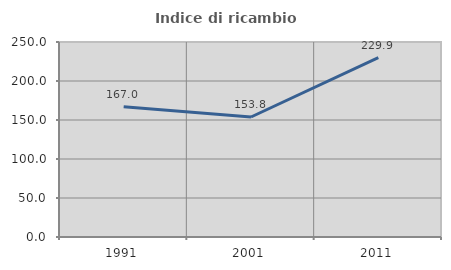
| Category | Indice di ricambio occupazionale  |
|---|---|
| 1991.0 | 167.041 |
| 2001.0 | 153.846 |
| 2011.0 | 229.89 |